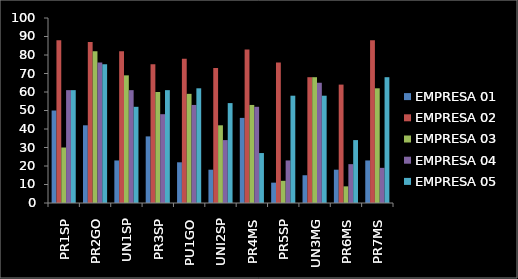
| Category | EMPRESA 01 | EMPRESA 02 | EMPRESA 03 | EMPRESA 04 | EMPRESA 05 |
|---|---|---|---|---|---|
| PR1SP | 50 | 88 | 30 | 61 | 61 |
| PR2GO | 42 | 87 | 82 | 76 | 75 |
| UN1SP | 23 | 82 | 69 | 61 | 52 |
| PR3SP | 36 | 75 | 60 | 48 | 61 |
| PU1GO | 22 | 78 | 59 | 53 | 62 |
| UNI2SP | 18 | 73 | 42 | 34 | 54 |
| PR4MS | 46 | 83 | 53 | 52 | 27 |
| PR5SP | 11 | 76 | 12 | 23 | 58 |
| UN3MG | 15 | 68 | 68 | 65 | 58 |
| PR6MS | 18 | 64 | 9 | 21 | 34 |
| PR7MS | 23 | 88 | 62 | 19 | 68 |